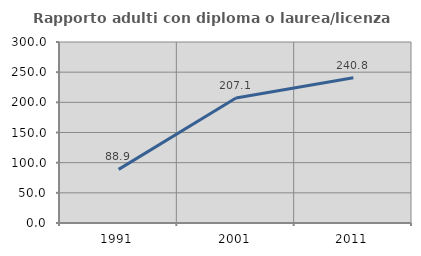
| Category | Rapporto adulti con diploma o laurea/licenza media  |
|---|---|
| 1991.0 | 88.866 |
| 2001.0 | 207.123 |
| 2011.0 | 240.786 |